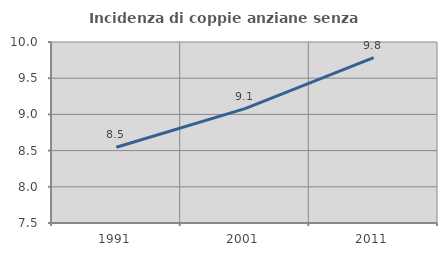
| Category | Incidenza di coppie anziane senza figli  |
|---|---|
| 1991.0 | 8.547 |
| 2001.0 | 9.08 |
| 2011.0 | 9.784 |